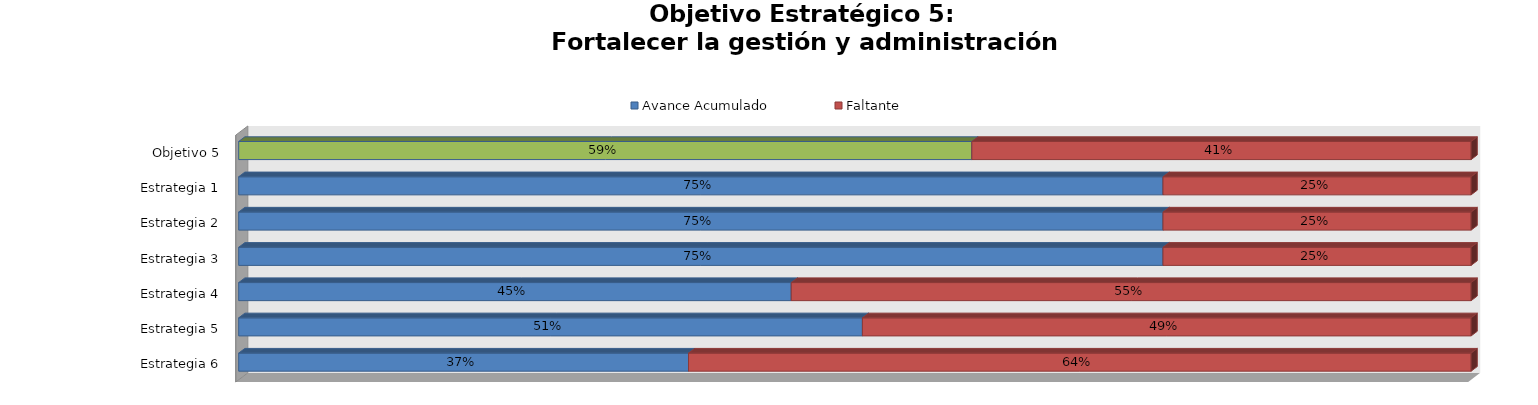
| Category | Avance Acumulado | Faltante |
|---|---|---|
| Estrategia 6 | 0.365 | 0.635 |
| Estrategia 5 | 0.506 | 0.494 |
| Estrategia 4 | 0.448 | 0.552 |
| Estrategia 3 | 0.75 | 0.25 |
| Estrategia 2 | 0.75 | 0.25 |
| Estrategia 1 | 0.75 | 0.25 |
| Objetivo 5 | 0.595 | 0.405 |